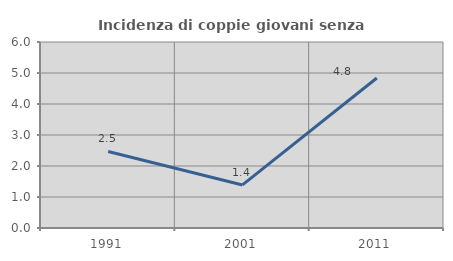
| Category | Incidenza di coppie giovani senza figli |
|---|---|
| 1991.0 | 2.469 |
| 2001.0 | 1.389 |
| 2011.0 | 4.839 |